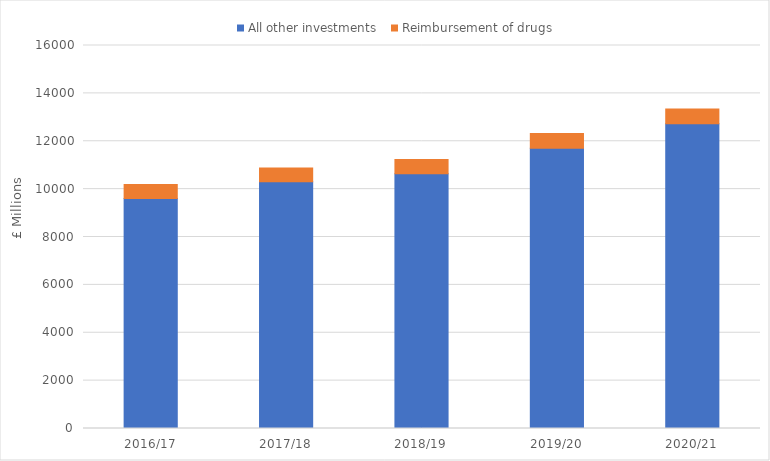
| Category | All other investments  | Reimbursement of drugs |
|---|---|---|
| 2016/17 | 9603.673 | 590.037 |
| 2017/18 | 10303.62 | 576.368 |
| 2018/19 | 10644.699 | 592.976 |
| 2019/20 | 11702.466 | 617.078 |
| 2020/21 | 12731.128 | 614.711 |